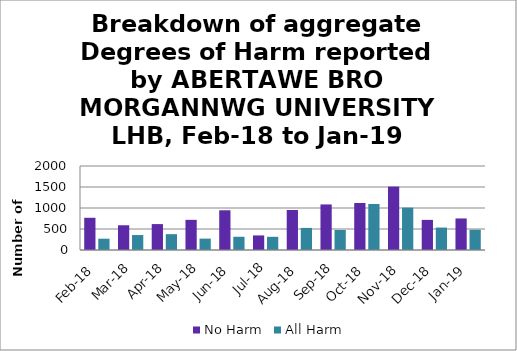
| Category | No Harm | All Harm |
|---|---|---|
| Feb-18 | 767 | 269 |
| Mar-18 | 589 | 356 |
| Apr-18 | 617 | 377 |
| May-18 | 718 | 271 |
| Jun-18 | 946 | 315 |
| Jul-18 | 347 | 314 |
| Aug-18 | 953 | 526 |
| Sep-18 | 1085 | 477 |
| Oct-18 | 1119 | 1095 |
| Nov-18 | 1510 | 1009 |
| Dec-18 | 717 | 534 |
| Jan-19 | 751 | 483 |